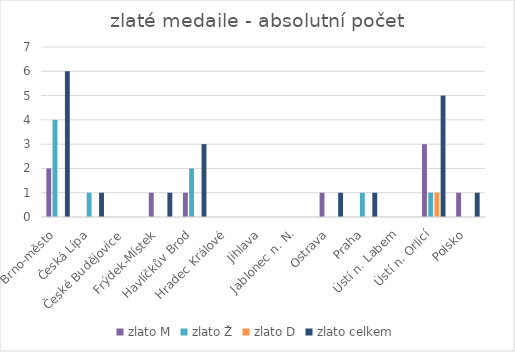
| Category | muži | ženy | celkem | zlato M | zlato Ž | zlato D | zlato celkem |
|---|---|---|---|---|---|---|---|
| Brno-město |  |  |  | 2 | 4 | 0 | 6 |
| Česká Lípa |  |  |  | 0 | 1 | 0 | 1 |
| České Budějovice |  |  |  | 0 | 0 | 0 | 0 |
| Frýdek-Místek |  |  |  | 1 | 0 | 0 | 1 |
| Havlíčkův Brod |  |  |  | 1 | 2 | 0 | 3 |
| Hradec Králové |  |  |  | 0 | 0 | 0 | 0 |
| Jihlava |  |  |  | 0 | 0 | 0 | 0 |
| Jablonec n. N. |  |  |  | 0 | 0 | 0 | 0 |
| Ostrava |  |  |  | 1 | 0 | 0 | 1 |
| Praha |  |  |  | 0 | 1 | 0 | 1 |
| Ústí n. Labem |  |  |  | 0 | 0 | 0 | 0 |
| Ústí n. Orlicí |  |  |  | 3 | 1 | 1 | 5 |
| Polsko |  |  |  | 1 | 0 | 0 | 1 |